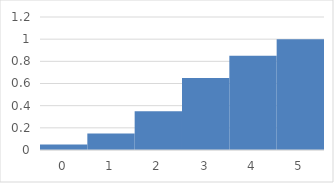
| Category | nr of packs sold / week |
|---|---|
| 0.0 | 0.05 |
| 1.0 | 0.15 |
| 2.0 | 0.35 |
| 3.0 | 0.65 |
| 4.0 | 0.85 |
| 5.0 | 1 |